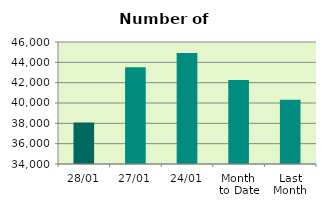
| Category | Series 0 |
|---|---|
| 28/01 | 38080 |
| 27/01 | 43510 |
| 24/01 | 44914 |
| Month 
to Date | 42259.895 |
| Last
Month | 40313.8 |